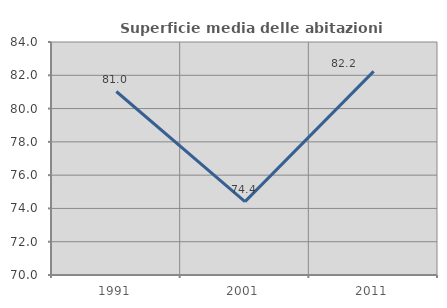
| Category | Superficie media delle abitazioni occupate |
|---|---|
| 1991.0 | 81.025 |
| 2001.0 | 74.408 |
| 2011.0 | 82.234 |